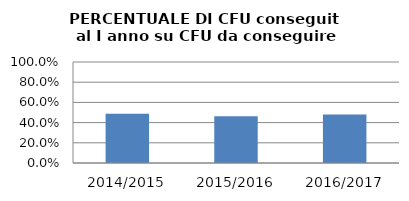
| Category | 2014/2015 2015/2016 2016/2017 |
|---|---|
| 2014/2015 | 0.486 |
| 2015/2016 | 0.462 |
| 2016/2017 | 0.48 |